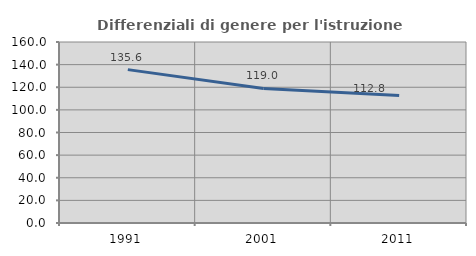
| Category | Differenziali di genere per l'istruzione superiore |
|---|---|
| 1991.0 | 135.592 |
| 2001.0 | 118.971 |
| 2011.0 | 112.77 |